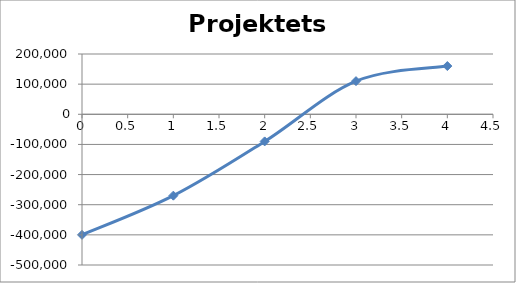
| Category | Projektets kapitalbehov |
|---|---|
| 0.0 | -400000 |
| 1.0 | -270000 |
| 2.0 | -90000 |
| 3.0 | 110000 |
| 4.0 | 160000 |